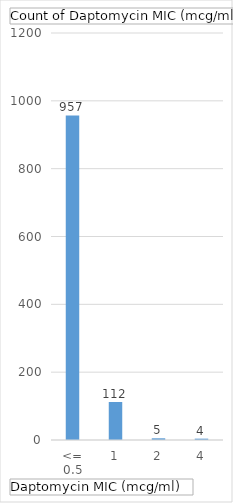
| Category | Total |
|---|---|
| <= 0.5 | 957 |
| 1 | 112 |
| 2 | 5 |
| 4 | 4 |